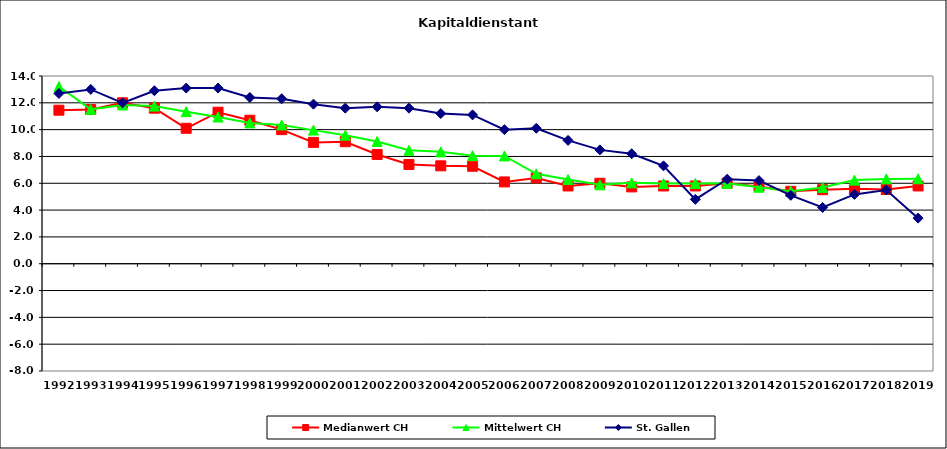
| Category | Medianwert CH | Mittelwert CH | St. Gallen |
|---|---|---|---|
| 1992.0 | 11.45 | 13.212 | 12.7 |
| 1993.0 | 11.5 | 11.512 | 13 |
| 1994.0 | 12 | 11.842 | 12 |
| 1995.0 | 11.6 | 11.756 | 12.9 |
| 1996.0 | 10.1 | 11.342 | 13.1 |
| 1997.0 | 11.3 | 10.938 | 13.1 |
| 1998.0 | 10.7 | 10.5 | 12.4 |
| 1999.0 | 10 | 10.35 | 12.3 |
| 2000.0 | 9.05 | 9.964 | 11.9 |
| 2001.0 | 9.1 | 9.588 | 11.6 |
| 2002.0 | 8.15 | 9.121 | 11.7 |
| 2003.0 | 7.4 | 8.458 | 11.6 |
| 2004.0 | 7.3 | 8.345 | 11.2 |
| 2005.0 | 7.27 | 8.061 | 11.1 |
| 2006.0 | 6.1 | 8.039 | 10 |
| 2007.0 | 6.4 | 6.706 | 10.1 |
| 2008.0 | 5.8 | 6.277 | 9.2 |
| 2009.0 | 6 | 5.883 | 8.49 |
| 2010.0 | 5.73 | 6.031 | 8.2 |
| 2011.0 | 5.8 | 5.983 | 7.3 |
| 2012.0 | 5.8 | 5.983 | 4.8 |
| 2013.0 | 6 | 5.994 | 6.3 |
| 2014.0 | 5.765 | 5.705 | 6.2 |
| 2015.0 | 5.4 | 5.408 | 5.1 |
| 2016.0 | 5.52 | 5.692 | 4.2 |
| 2017.0 | 5.6 | 6.235 | 5.17 |
| 2018.0 | 5.535 | 6.326 | 5.5 |
| 2019.0 | 5.8 | 6.335 | 3.4 |